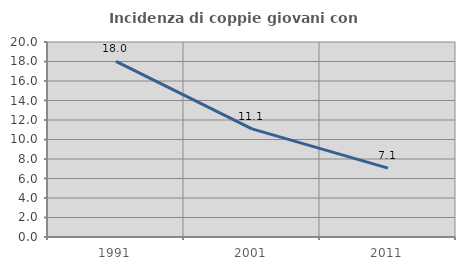
| Category | Incidenza di coppie giovani con figli |
|---|---|
| 1991.0 | 18.008 |
| 2001.0 | 11.089 |
| 2011.0 | 7.066 |